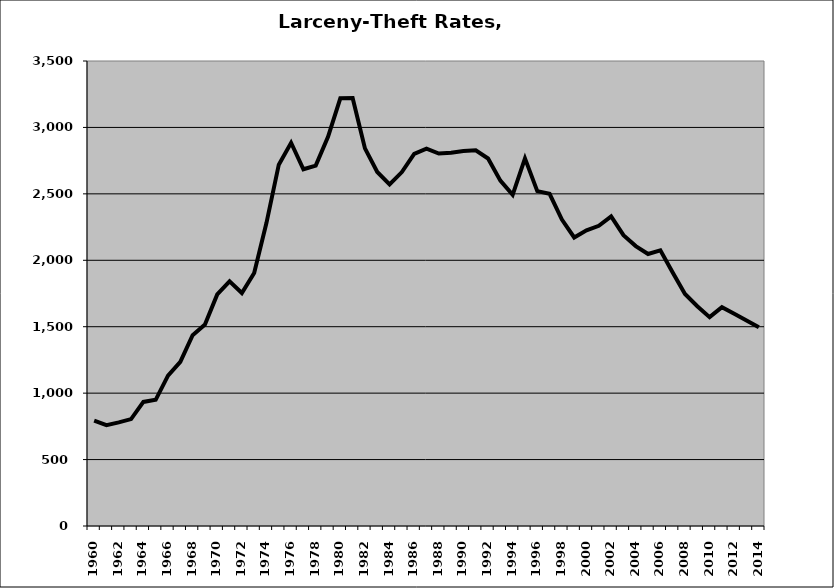
| Category | Larceny-Theft |
|---|---|
| 1960.0 | 792.918 |
| 1961.0 | 759.122 |
| 1962.0 | 780.266 |
| 1963.0 | 804.82 |
| 1964.0 | 933.708 |
| 1965.0 | 950 |
| 1966.0 | 1131.198 |
| 1967.0 | 1235.815 |
| 1968.0 | 1436.536 |
| 1969.0 | 1516.864 |
| 1970.0 | 1743.444 |
| 1971.0 | 1841.795 |
| 1972.0 | 1753.729 |
| 1973.0 | 1904.614 |
| 1974.0 | 2282.067 |
| 1975.0 | 2719.756 |
| 1976.0 | 2884.599 |
| 1977.0 | 2685.099 |
| 1978.0 | 2712.949 |
| 1979.0 | 2928.798 |
| 1980.0 | 3219.096 |
| 1981.0 | 3221.712 |
| 1982.0 | 2842.272 |
| 1983.0 | 2664.441 |
| 1984.0 | 2571.065 |
| 1985.0 | 2664.182 |
| 1986.0 | 2801.263 |
| 1987.0 | 2840.12 |
| 1988.0 | 2803.352 |
| 1989.0 | 2809.894 |
| 1990.0 | 2822.863 |
| 1991.0 | 2827.549 |
| 1992.0 | 2766.287 |
| 1993.0 | 2599.431 |
| 1994.0 | 2492.294 |
| 1995.0 | 2767.241 |
| 1996.0 | 2520.792 |
| 1997.0 | 2500.035 |
| 1998.0 | 2306.639 |
| 1999.0 | 2171.733 |
| 2000.0 | 2225.249 |
| 2001.0 | 2259.371 |
| 2002.0 | 2330.202 |
| 2003.0 | 2189.005 |
| 2004.0 | 2106.875 |
| 2005.0 | 2047.631 |
| 2006.0 | 2074.857 |
| 2007.0 | 1907.467 |
| 2008.0 | 1746.901 |
| 2009.0 | 1654.235 |
| 2010.0 | 1571.813 |
| 2011.0 | 1647.206 |
| 2012.0 | 1597.248 |
| 2013.0 | 1545.852 |
| 2014.0 | 1495.82 |